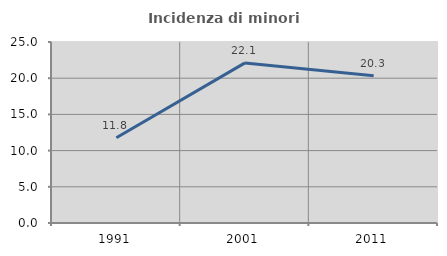
| Category | Incidenza di minori stranieri |
|---|---|
| 1991.0 | 11.765 |
| 2001.0 | 22.115 |
| 2011.0 | 20.334 |